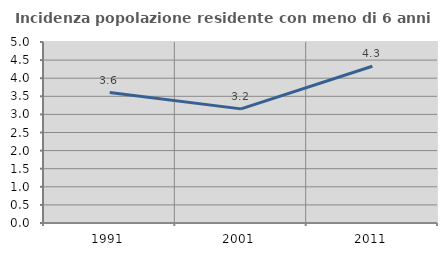
| Category | Incidenza popolazione residente con meno di 6 anni |
|---|---|
| 1991.0 | 3.604 |
| 2001.0 | 3.153 |
| 2011.0 | 4.33 |